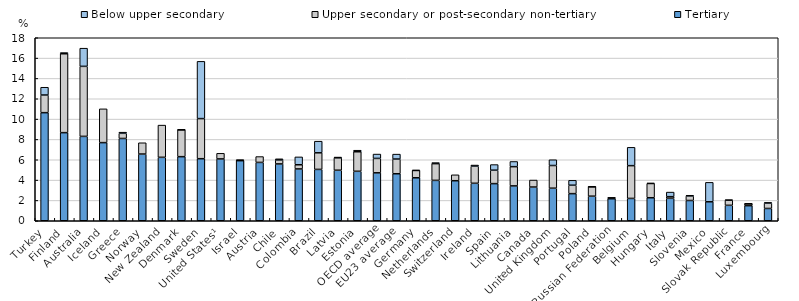
| Category | Tertiary | Upper secondary or post-secondary non-tertiary | Below upper secondary |
|---|---|---|---|
| Turkey | 10.631 | 1.737 | 0.764 |
| Finland | 8.666 | 7.761 | 0.117 |
| Australia | 8.3 | 6.886 | 1.788 |
| Iceland | 7.685 | 3.323 | 0 |
| Greece | 8.094 | 0.508 | 0.112 |
| Norway | 6.562 | 1.11 | 0 |
| New Zealand | 6.239 | 3.169 | 0 |
| Denmark | 6.303 | 2.646 | 0 |
| Sweden | 6.103 | 3.944 | 5.633 |
| United States¹ | 6.082 | 0.551 | 0 |
| Israel | 5.911 | 0.048 | 0 |
| Austria | 5.738 | 0.576 | 0 |
| Chile | 5.591 | 0.391 | 0.111 |
| Colombia | 5.097 | 0.41 | 0.773 |
| Brazil | 5.051 | 1.632 | 1.143 |
| Latvia | 4.97 | 1.218 | 0.077 |
| Estonia | 4.864 | 1.922 | 0.152 |
| OECD average | 4.715 | 1.416 | 0.429 |
| EU23 average | 4.623 | 1.447 | 0.483 |
| Germany | 4.228 | 0.719 | 0.03 |
| Netherlands | 3.971 | 1.645 | 0.104 |
| Switzerland | 3.938 | 0.582 | 0 |
| Ireland | 3.685 | 1.686 | 0.109 |
| Spain | 3.652 | 1.323 | 0.55 |
| Lithuania | 3.43 | 1.889 | 0.511 |
| Canada | 3.317 | 0.687 | 0 |
| United Kingdom | 3.203 | 2.23 | 0.568 |
| Portugal | 2.668 | 0.828 | 0.482 |
| Poland | 2.417 | 0.927 | 0.002 |
| Russian Federation | 2.166 | 0.082 | 0.014 |
| Belgium | 2.197 | 3.222 | 1.803 |
| Hungary | 2.262 | 1.403 | 0.034 |
| Italy | 2.207 | 0.161 | 0.451 |
| Slovenia | 1.992 | 0.447 | 0.071 |
| Mexico | 1.865 | 0 | 1.911 |
| Slovak Republic | 1.517 | 0.506 | 0.029 |
| France | 1.484 | 0.185 | 0 |
| Luxembourg | 1.209 | 0.531 | 0.056 |